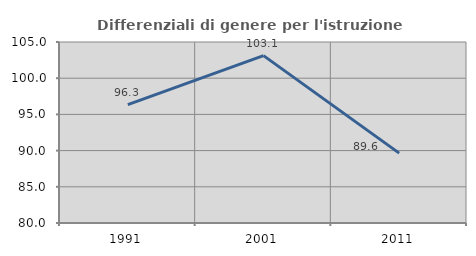
| Category | Differenziali di genere per l'istruzione superiore |
|---|---|
| 1991.0 | 96.346 |
| 2001.0 | 103.12 |
| 2011.0 | 89.648 |